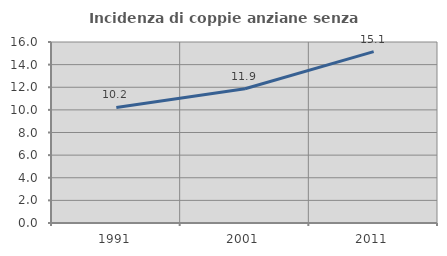
| Category | Incidenza di coppie anziane senza figli  |
|---|---|
| 1991.0 | 10.214 |
| 2001.0 | 11.87 |
| 2011.0 | 15.148 |